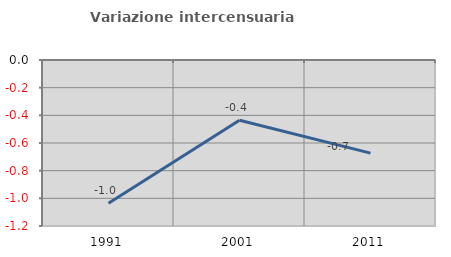
| Category | Variazione intercensuaria annua |
|---|---|
| 1991.0 | -1.035 |
| 2001.0 | -0.436 |
| 2011.0 | -0.673 |